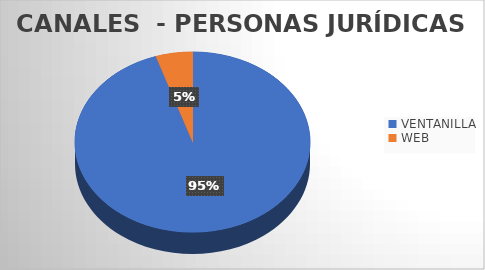
| Category | total |
|---|---|
| VENTANILLA | 75 |
| WEB | 4 |